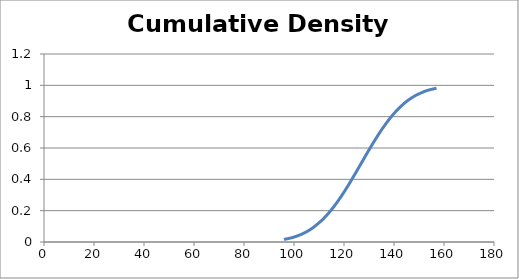
| Category | F(x) |
|---|---|
| 96.0 | 0.016 |
| 99.0 | 0.027 |
| 101.0 | 0.037 |
| 103.0 | 0.049 |
| 103.0 | 0.049 |
| 104.0 | 0.057 |
| 104.0 | 0.057 |
| 104.0 | 0.057 |
| 105.0 | 0.065 |
| 106.0 | 0.074 |
| 106.0 | 0.074 |
| 106.0 | 0.074 |
| 106.0 | 0.074 |
| 107.0 | 0.085 |
| 107.0 | 0.085 |
| 108.0 | 0.096 |
| 111.0 | 0.136 |
| 112.0 | 0.152 |
| 112.0 | 0.152 |
| 113.0 | 0.169 |
| 113.0 | 0.169 |
| 114.0 | 0.187 |
| 114.0 | 0.187 |
| 115.0 | 0.206 |
| 116.0 | 0.227 |
| 116.0 | 0.227 |
| 117.0 | 0.248 |
| 117.0 | 0.248 |
| 117.0 | 0.248 |
| 118.0 | 0.271 |
| 119.0 | 0.294 |
| 119.0 | 0.294 |
| 120.0 | 0.318 |
| 120.0 | 0.318 |
| 120.0 | 0.318 |
| 121.0 | 0.344 |
| 121.0 | 0.344 |
| 121.0 | 0.344 |
| 122.0 | 0.37 |
| 124.0 | 0.423 |
| 125.0 | 0.45 |
| 125.0 | 0.45 |
| 126.0 | 0.478 |
| 126.0 | 0.478 |
| 126.0 | 0.478 |
| 126.0 | 0.478 |
| 127.0 | 0.506 |
| 127.0 | 0.506 |
| 128.0 | 0.533 |
| 129.0 | 0.561 |
| 129.0 | 0.561 |
| 130.0 | 0.588 |
| 130.0 | 0.588 |
| 130.0 | 0.588 |
| 130.0 | 0.588 |
| 130.0 | 0.588 |
| 130.0 | 0.588 |
| 131.0 | 0.615 |
| 131.0 | 0.615 |
| 132.0 | 0.641 |
| 132.0 | 0.641 |
| 132.0 | 0.641 |
| 133.0 | 0.666 |
| 133.0 | 0.666 |
| 133.0 | 0.666 |
| 133.0 | 0.666 |
| 134.0 | 0.691 |
| 134.0 | 0.691 |
| 134.0 | 0.691 |
| 135.0 | 0.715 |
| 136.0 | 0.738 |
| 136.0 | 0.738 |
| 136.0 | 0.738 |
| 136.0 | 0.738 |
| 138.0 | 0.781 |
| 138.0 | 0.781 |
| 138.0 | 0.781 |
| 139.0 | 0.801 |
| 140.0 | 0.82 |
| 140.0 | 0.82 |
| 140.0 | 0.82 |
| 141.0 | 0.838 |
| 141.0 | 0.838 |
| 141.0 | 0.838 |
| 141.0 | 0.838 |
| 142.0 | 0.854 |
| 142.0 | 0.854 |
| 144.0 | 0.884 |
| 145.0 | 0.897 |
| 146.0 | 0.909 |
| 147.0 | 0.92 |
| 147.0 | 0.92 |
| 147.0 | 0.92 |
| 148.0 | 0.929 |
| 148.0 | 0.929 |
| 149.0 | 0.938 |
| 152.0 | 0.96 |
| 153.0 | 0.965 |
| 154.0 | 0.97 |
| 157.0 | 0.982 |